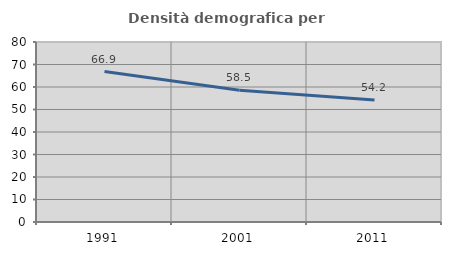
| Category | Densità demografica |
|---|---|
| 1991.0 | 66.857 |
| 2001.0 | 58.536 |
| 2011.0 | 54.222 |